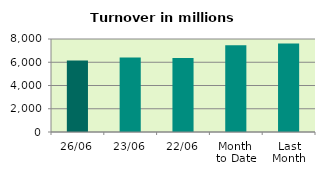
| Category | Series 0 |
|---|---|
| 26/06 | 6159.536 |
| 23/06 | 6405.367 |
| 22/06 | 6357.181 |
| Month 
to Date | 7453.129 |
| Last
Month | 7604.877 |